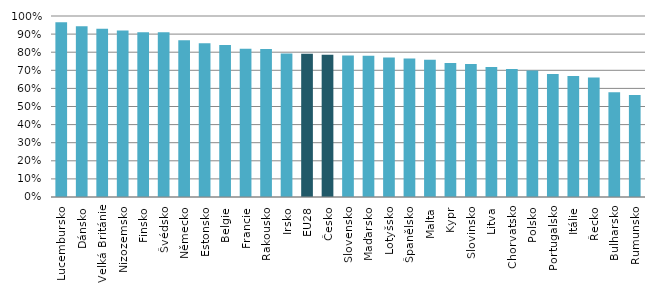
| Category | Series 0 |
|---|---|
| Lucembursko | 0.966 |
| Dánsko | 0.943 |
| Velká Británie | 0.929 |
| Nizozemsko | 0.92 |
| Finsko | 0.91 |
| Švédsko | 0.91 |
| Německo | 0.866 |
| Estonsko | 0.85 |
| Belgie | 0.84 |
| Francie | 0.818 |
| Rakousko | 0.818 |
| Irsko | 0.792 |
| EU28 | 0.792 |
| Česko | 0.786 |
| Slovensko | 0.782 |
| Maďarsko | 0.781 |
| Lotyšsko | 0.77 |
| Španělsko | 0.765 |
| Malta | 0.759 |
| Kypr | 0.741 |
| Slovinsko | 0.735 |
| Litva | 0.718 |
| Chorvatsko | 0.707 |
| Polsko | 0.699 |
| Portugalsko | 0.68 |
| Itálie | 0.669 |
| Řecko | 0.66 |
| Bulharsko | 0.579 |
| Rumunsko | 0.563 |